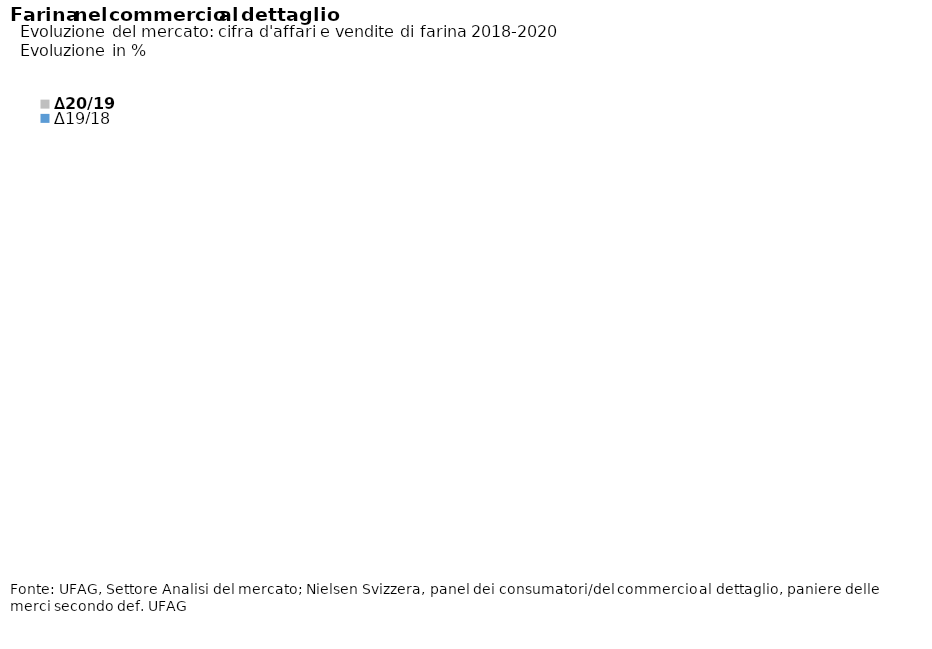
| Category | ∆20/19 | ∆19/18 |
|---|---|---|
| Farina bianca | 30.119 | 1.763 |
| Farina semibianca | 56.587 | 2.235 |
| Farina bigia | 61.01 | 16.696 |
| Farina per treccia | 30.638 | -0.684 |
| Farina di spelta | 47.893 | 10.564 |
| Farina per spätzli | 18.539 | 4.845 |
| Resto | 52.736 | 19.641 |